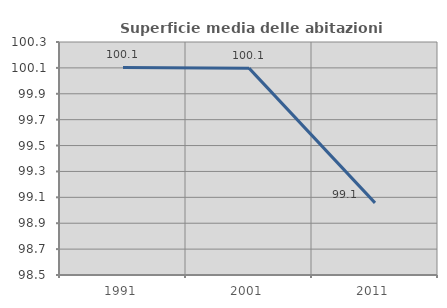
| Category | Superficie media delle abitazioni occupate |
|---|---|
| 1991.0 | 100.103 |
| 2001.0 | 100.098 |
| 2011.0 | 99.057 |